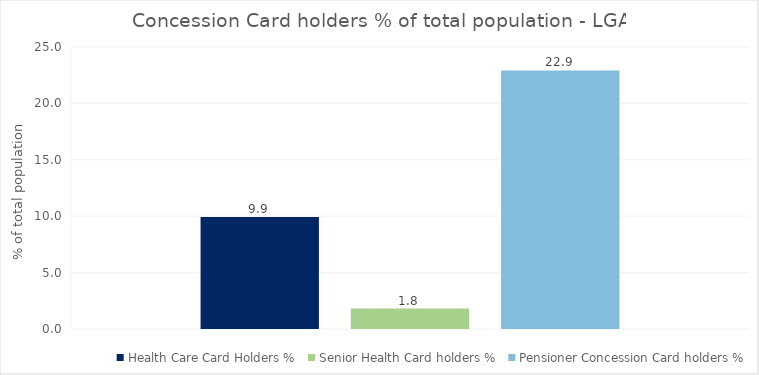
| Category | Health Care Card Holders % | Senior Health Card holders % | Pensioner Concession Card holders % |
|---|---|---|---|
| Total | 9.925 | 1.817 | 22.924 |